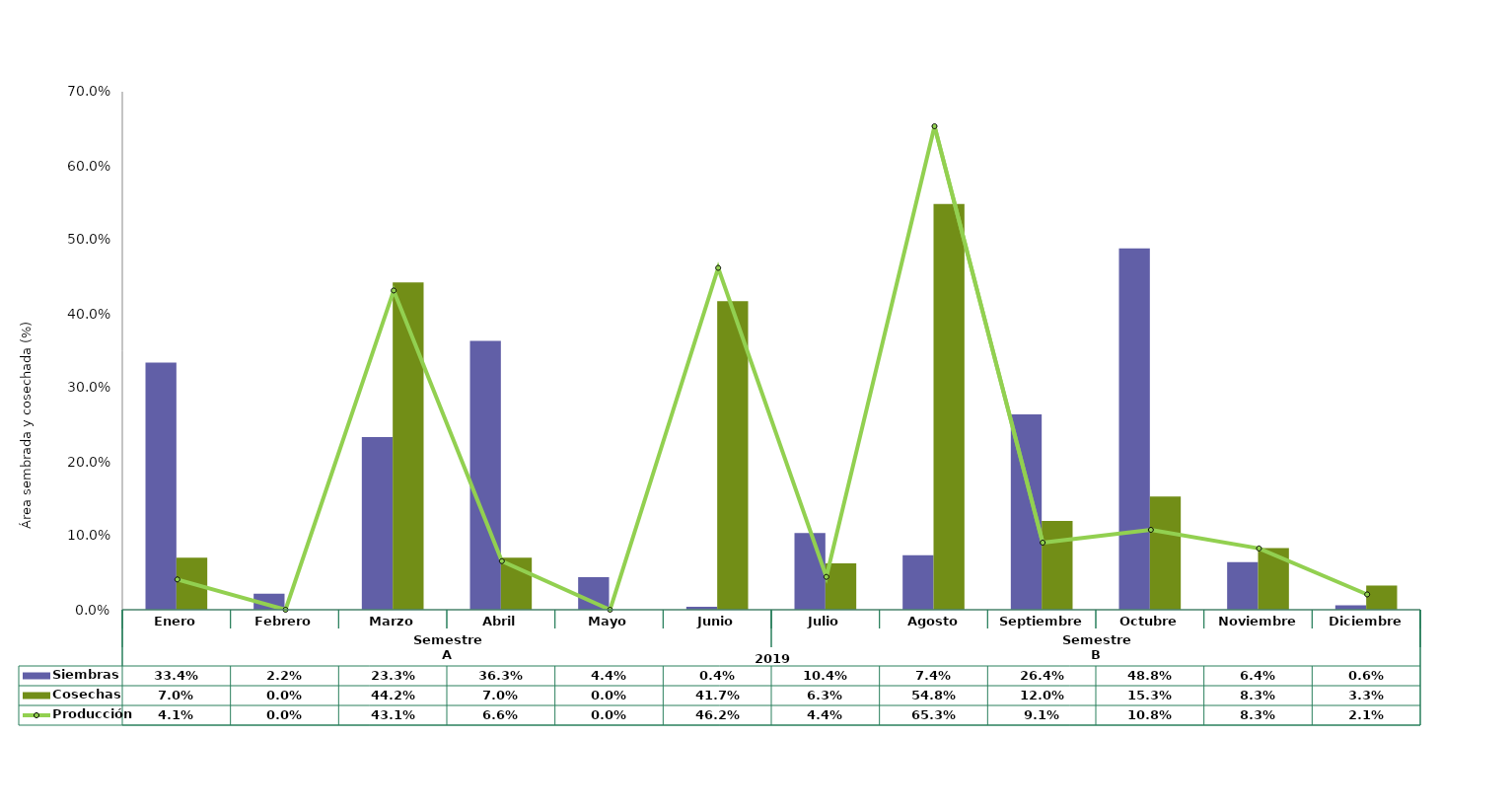
| Category | Siembras | Cosechas   |
|---|---|---|
| 0 | 0.334 | 0.07 |
| 1 | 0.022 | 0 |
| 2 | 0.233 | 0.442 |
| 3 | 0.363 | 0.07 |
| 4 | 0.044 | 0 |
| 5 | 0.004 | 0.417 |
| 6 | 0.104 | 0.063 |
| 7 | 0.074 | 0.548 |
| 8 | 0.264 | 0.12 |
| 9 | 0.488 | 0.153 |
| 10 | 0.064 | 0.083 |
| 11 | 0.006 | 0.033 |